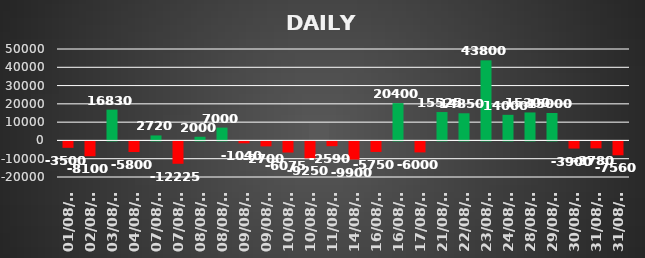
| Category | Series 0 |
|---|---|
| 2023-08-01 | -3500 |
| 2023-08-02 | -8100 |
| 2023-08-03 | 16830 |
| 2023-08-04 | -5800 |
| 2023-08-07 | 2720 |
| 2023-08-07 | -12225 |
| 2023-08-08 | 2000 |
| 2023-08-08 | 7000 |
| 2023-08-09 | -1040 |
| 2023-08-09 | -2700 |
| 2023-08-10 | -6075 |
| 2023-08-10 | -9250 |
| 2023-08-11 | -2590 |
| 2023-08-14 | -9900 |
| 2023-08-16 | -5750 |
| 2023-08-16 | 20400 |
| 2023-08-17 | -6000 |
| 2023-08-21 | 15525 |
| 2023-08-22 | 14850 |
| 2023-08-23 | 43800 |
| 2023-08-24 | 14000 |
| 2023-08-28 | 15300 |
| 2023-08-29 | 15000 |
| 2023-08-30 | -3900 |
| 2023-08-31 | -3780 |
| 2023-08-31 | -7560 |